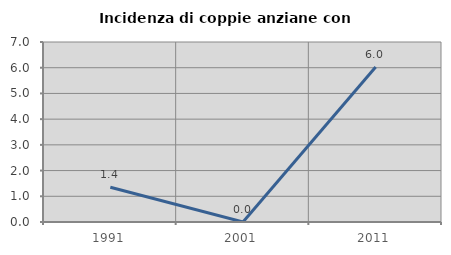
| Category | Incidenza di coppie anziane con figli |
|---|---|
| 1991.0 | 1.351 |
| 2001.0 | 0 |
| 2011.0 | 6.024 |